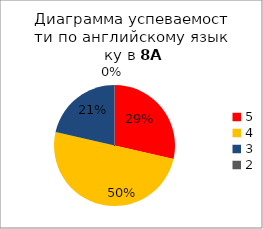
| Category | Series 0 |
|---|---|
| 5.0 | 4 |
| 4.0 | 7 |
| 3.0 | 3 |
| 2.0 | 0 |